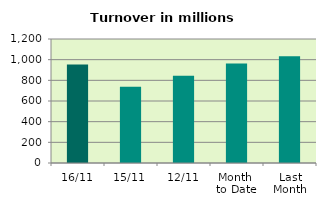
| Category | Series 0 |
|---|---|
| 16/11 | 954.041 |
| 15/11 | 737.087 |
| 12/11 | 844.155 |
| Month 
to Date | 963.432 |
| Last
Month | 1032.218 |